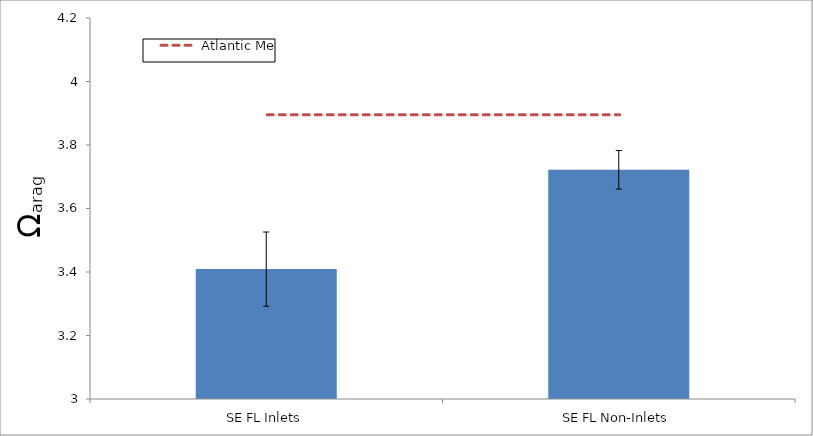
| Category | Series 0 |
|---|---|
| SE FL Inlets | 3.409 |
| SE FL Non-Inlets | 3.722 |